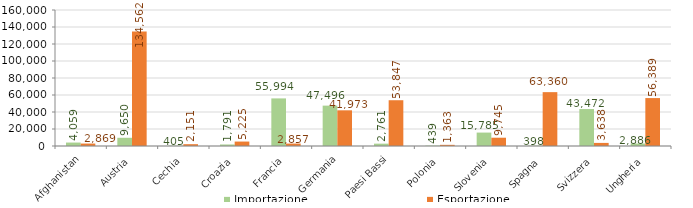
| Category | Importazione | Esportazione |
|---|---|---|
| Afghanistan | 4059 | 2869 |
| Austria | 9650 | 134562 |
| Cechia | 405 | 2151 |
| Croazia | 1791 | 5225 |
| Francia | 55994 | 2857 |
| Germania | 47496 | 41973 |
| Paesi Bassi | 2761 | 53847 |
| Polonia | 439 | 1363 |
| Slovenia | 15785 | 9745 |
| Spagna | 398 | 63360 |
| Svizzera | 43472 | 3638 |
| Ungheria | 2886 | 56389 |